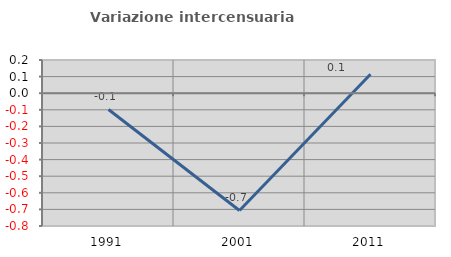
| Category | Variazione intercensuaria annua |
|---|---|
| 1991.0 | -0.098 |
| 2001.0 | -0.706 |
| 2011.0 | 0.114 |